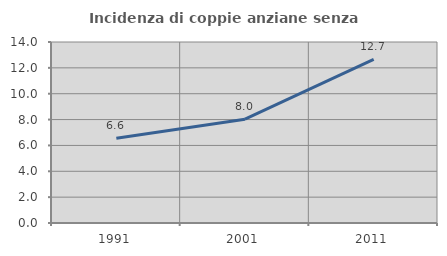
| Category | Incidenza di coppie anziane senza figli  |
|---|---|
| 1991.0 | 6.563 |
| 2001.0 | 8.031 |
| 2011.0 | 12.664 |